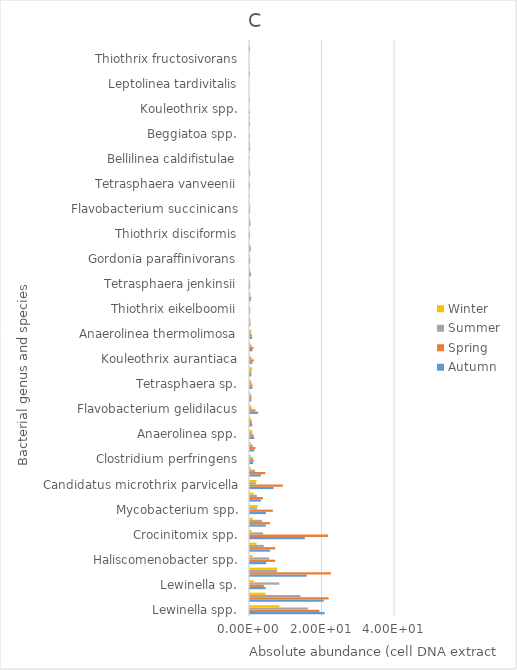
| Category | Autumn | Spring | Summer | Winter |
|---|---|---|---|---|
| Lewinella spp. | 20.584 | 19.15 | 15.961 | 8.098 |
| Sphaerotilus spp. | 20.344 | 21.697 | 13.918 | 4.286 |
| Lewinella sp. | 4.3 | 3.801 | 8.087 | 1.023 |
| Tetrasphaera spp. | 15.648 | 22.338 | 7.446 | 7.506 |
| Haliscomenobacter spp. | 4.455 | 6.918 | 5.29 | 0.759 |
| Bellilinea spp. | 5.534 | 6.963 | 3.785 | 1.796 |
| Crocinitomix spp. | 15.111 | 21.508 | 3.598 | 0.455 |
| Haliscomenobacter hydrossis | 4.349 | 5.472 | 3.276 | 0.786 |
| Mycobacterium spp. | 4.392 | 6.302 | 1.955 | 2.151 |
| #DIV/0! | 3.012 | 3.576 | 1.889 | 0.98 |
| Candidatus microthrix parvicella | 6.477 | 9.074 | 1.615 | 1.806 |
| Fluviicola spp. | 3.004 | 4.216 | 1.397 | 0.248 |
| Clostridium perfringens | 0.832 | 1.026 | 0.788 | 0.252 |
| Haliscomenobacter sp. | 1.194 | 1.494 | 0.764 | 0.291 |
| Anaerolinea spp. | 1.155 | 0.995 | 0.585 | 0.614 |
| Levilinea spp. | 0.633 | 0.504 | 0.52 | 0.237 |
| Flavobacterium gelidilacus | 2.232 | 1.485 | 0.463 | 0.267 |
| Longilinea spp. | 0.39 | 0.355 | 0.436 | 0.074 |
| Tetrasphaera sp. | 0.665 | 0.697 | 0.413 | 0.279 |
| Acinetobacter johnsonii | 0.386 | 0.335 | 0.409 | 0.631 |
| Kouleothrix aurantiaca | 0.666 | 1.039 | 0.386 | 0.097 |
| Candidatus monilibacter batavus | 0.681 | 0.926 | 0.371 | 0.062 |
| Anaerolinea thermolimosa | 0.609 | 0.508 | 0.288 | 0.389 |
| Aquicella lusitana | 0.118 | 0.105 | 0.109 | 0.036 |
| Thiothrix eikelboomii | 0.048 | 0.05 | 0.101 | 0 |
| Uncultured candidatus microthrix sp. | 0.25 | 0.311 | 0.093 | 0.075 |
| Tetrasphaera jenkinsii | 0.043 | 0.056 | 0.073 | 0.024 |
| Beggiatoa sp. | 0.274 | 0.19 | 0.036 | 0.029 |
| Gordonia paraffinivorans | 0.047 | 0.083 | 0.016 | 0.025 |
| Crenothrix polyspora | 0.178 | 0.215 | 0.015 | 0 |
| Thiothrix disciformis | 0.002 | 0.004 | 0.014 | 0 |
| Aquicella spp. | 0.108 | 0.174 | 0.014 | 0.012 |
| Flavobacterium succinicans | 0.022 | 0.039 | 0.013 | 0.1 |
| Levilinea saccharolytica | 0 | 0 | 0.013 | 0 |
| Tetrasphaera vanveenii | 0.004 | 0.004 | 0.007 | 0 |
| Thiothrix spp. | 0.032 | 0.056 | 0.007 | 0 |
| Bellilinea caldifistulae | 0 | 0 | 0.007 | 0 |
| Candidatus alysiosphaera europeae | 0.052 | 0.06 | 0.007 | 0.066 |
| Beggiatoa spp. | 0.007 | 0.009 | 0 | 0 |
| Candidatus microthrix calida | 0.036 | 0.015 | 0 | 0.012 |
| Kouleothrix spp. | 0.017 | 0 | 0 | 0 |
| Leptolinea spp. | 0.003 | 0 | 0 | 0 |
| Leptolinea tardivitalis | 0 | 0 | 0 | 0 |
| Tetrasphaera australiensis | 0.004 | 0.007 | 0 | 0.012 |
| Thiothrix fructosivorans | 0 | 0 | 0 | 0 |
| Thiothrix sp. | 0.005 | 0.008 | 0 | 0 |